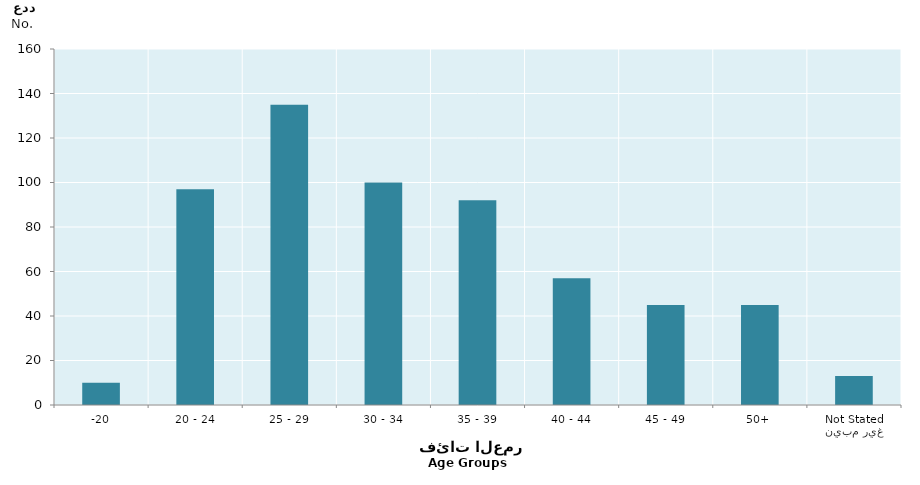
| Category | Series 0 |
|---|---|
| -20 | 10 |
| 20 - 24 | 97 |
| 25 - 29 | 135 |
| 30 - 34 | 100 |
| 35 - 39 | 92 |
| 40 - 44 | 57 |
| 45 - 49 | 45 |
| 50+ | 45 |
| غير مبين
Not Stated | 13 |